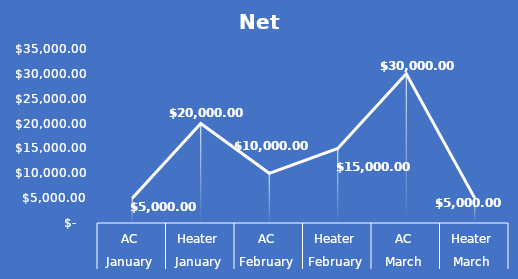
| Category | Net Sales |
|---|---|
| 0 | 5000 |
| 1 | 20000 |
| 2 | 10000 |
| 3 | 15000 |
| 4 | 30000 |
| 5 | 5000 |